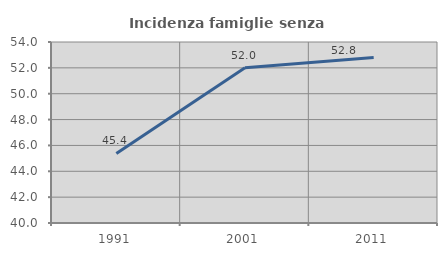
| Category | Incidenza famiglie senza nuclei |
|---|---|
| 1991.0 | 45.378 |
| 2001.0 | 52 |
| 2011.0 | 52.797 |